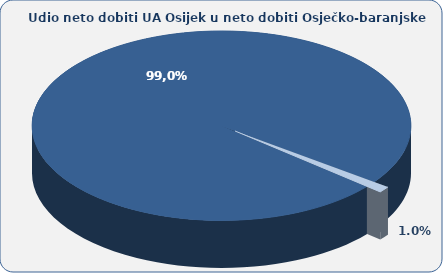
| Category | 99,0 1,0 |
|---|---|
| UA Osijek | 98.966 |
| OBŽ (ostali gradovi i općine) | 1.034 |